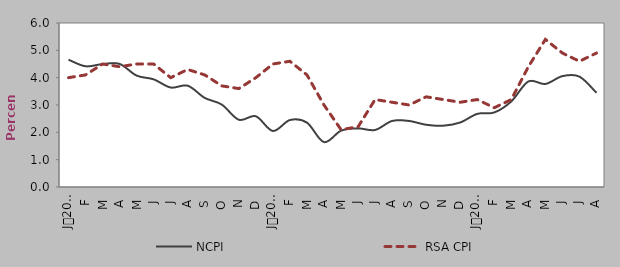
| Category | NCPI | RSA CPI |
|---|---|---|
| 0 | 4.658 | 4 |
| 1900-01-01 | 4.416 | 4.1 |
| 1900-01-02 | 4.498 | 4.5 |
| 1900-01-03 | 4.503 | 4.4 |
| 1900-01-04 | 4.076 | 4.5 |
| 1900-01-05 | 3.939 | 4.5 |
| 1900-01-06 | 3.639 | 4 |
| 1900-01-07 | 3.705 | 4.3 |
| 1900-01-08 | 3.259 | 4.1 |
| 1900-01-09 | 3.015 | 3.7 |
| 1900-01-10 | 2.461 | 3.6 |
| 1900-01-11 | 2.588 | 4 |
| 1900-01-12 | 2.05 | 4.5 |
| 1900-01-13 | 2.45 | 4.6 |
| 1900-01-14 | 2.354 | 4.1 |
| 1900-01-15 | 1.643 | 3 |
| 1900-01-16 | 2.06 | 2.1 |
| 1900-01-17 | 2.145 | 2.2 |
| 1900-01-18 | 2.087 | 3.2 |
| 1900-01-19 | 2.416 | 3.1 |
| 1900-01-20 | 2.416 | 3 |
| 1900-01-21 | 2.277 | 3.3 |
| 1900-01-22 | 2.242 | 3.2 |
| 1900-01-23 | 2.361 | 3.1 |
| 1900-01-24 | 2.676 | 3.2 |
| 1900-01-25 | 2.728 | 2.9 |
| 1900-01-26 | 3.133 | 3.2 |
| 1900-01-27 | 3.861 | 4.4 |
| 1900-01-28 | 3.769 | 5.4 |
| 1900-01-29 | 4.057 | 4.9 |
| 1900-01-30 | 4.038 | 4.6 |
| 1900-01-31 | 3.445 | 4.9 |